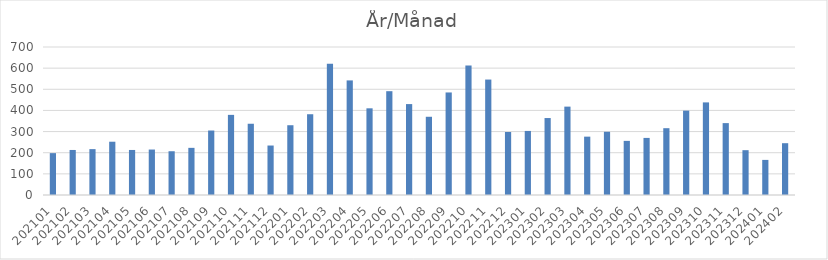
| Category | Summa |
|---|---|
| 202101 | 198 |
| 202102 | 213 |
| 202103 | 217 |
| 202104 | 252 |
| 202105 | 213 |
| 202106 | 215 |
| 202107 | 207 |
| 202108 | 223 |
| 202109 | 305 |
| 202110 | 379 |
| 202111 | 337 |
| 202112 | 234 |
| 202201 | 330 |
| 202202 | 382 |
| 202203 | 621 |
| 202204 | 542 |
| 202205 | 410 |
| 202206 | 491 |
| 202207 | 430 |
| 202208 | 370 |
| 202209 | 485 |
| 202210 | 612 |
| 202211 | 546 |
| 202212 | 298 |
| 202301 | 303 |
| 202302 | 364 |
| 202303 | 418 |
| 202304 | 276 |
| 202305 | 299 |
| 202306 | 256 |
| 202307 | 270 |
| 202308 | 316 |
| 202309 | 399 |
| 202310 | 438 |
| 202311 | 340 |
| 202312 | 212 |
| 202401 | 166 |
| 202402 | 245 |